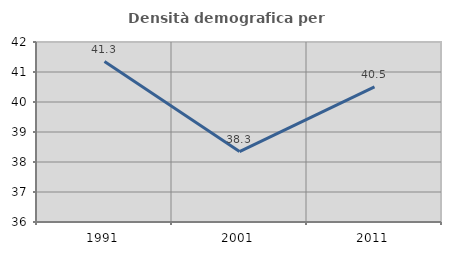
| Category | Densità demografica |
|---|---|
| 1991.0 | 41.346 |
| 2001.0 | 38.346 |
| 2011.0 | 40.506 |